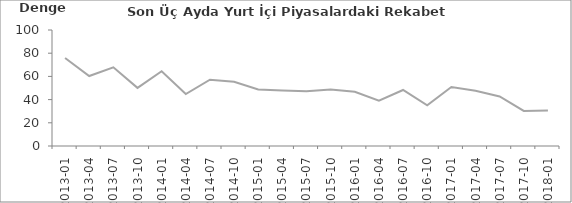
| Category | Son Üç Aydaki Yurt İçi Piyasalarda Rekabet Gücü |
|---|---|
| 2013-01 | 75.9 |
| 2013-04 | 60.3 |
| 2013-07 | 67.8 |
| 2013-10 | 50.1 |
| 2014-01 | 64.4 |
| 2014-04 | 44.8 |
| 2014-07 | 57.1 |
| 2014-10 | 55.4 |
| 2015-01 | 48.8 |
| 2015-04 | 47.8 |
| 2015-07 | 47.1 |
| 2015-10 | 48.8 |
| 2016-01 | 46.8 |
| 2016-04 | 39.1 |
| 2016-07 | 48.3 |
| 2016-10 | 35.1 |
| 2017-01 | 50.8 |
| 2017-04 | 47.7 |
| 2017-07 | 42.7 |
| 2017-10 | 30.2 |
| 2018-01 | 30.6 |